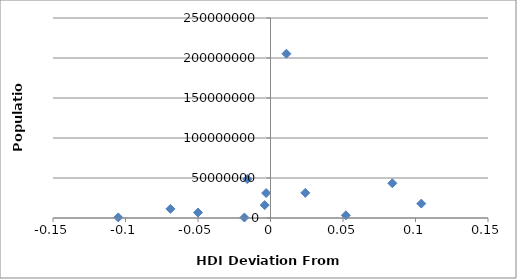
| Category | Population |
|---|---|
| 0.08399999999999996 | 43417000 |
| -0.06899999999999995 | 11410651 |
| 0.01100000000000001 | 205338000 |
| 0.10399999999999998 | 18006407 |
| -0.016000000000000014 | 48663285 |
| -0.0040000000000000036 | 16144000 |
| -0.10499999999999998 | 735554 |
| -0.050000000000000044 | 6783272 |
| -0.0030000000000000027 | 31151643 |
| -0.018000000000000016 | 573311 |
| 0.052000000000000046 | 3324460 |
| 0.02400000000000002 | 31416000 |